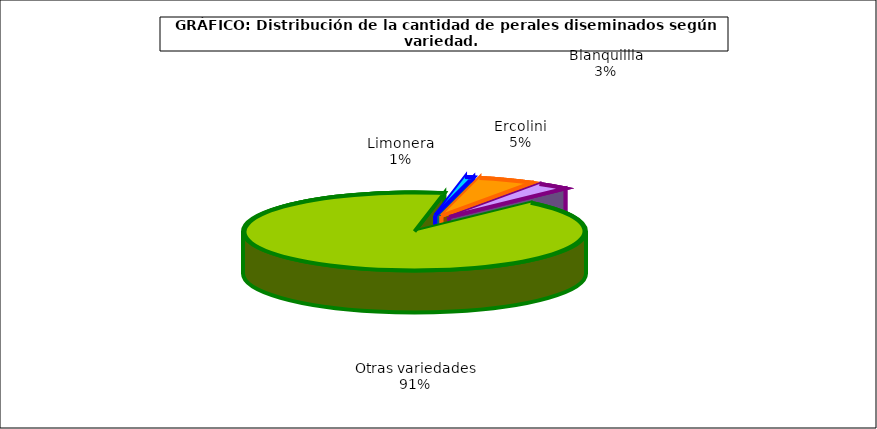
| Category | arboles |
|---|---|
| 0 | 3.892 |
| 1 | 26.402 |
| 2 | 15.182 |
| 3 | 456.06 |